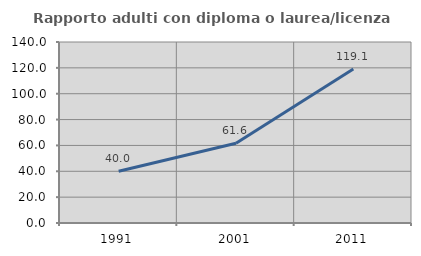
| Category | Rapporto adulti con diploma o laurea/licenza media  |
|---|---|
| 1991.0 | 39.965 |
| 2001.0 | 61.63 |
| 2011.0 | 119.136 |